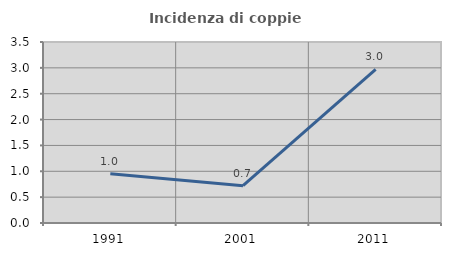
| Category | Incidenza di coppie miste |
|---|---|
| 1991.0 | 0.954 |
| 2001.0 | 0.722 |
| 2011.0 | 2.972 |